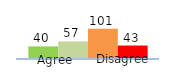
| Category | Series 0 | Series 1 | Series 2 | Series 3 |
|---|---|---|---|---|
| 0 | 40 | 57 | 101 | 43 |